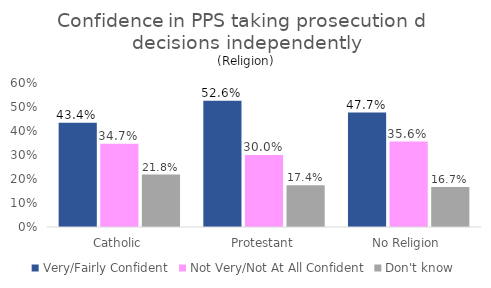
| Category | Very/Fairly Confident | Not Very/Not At All Confident | Don't know |
|---|---|---|---|
| Catholic | 0.434 | 0.347 | 0.218 |
| Protestant | 0.526 | 0.3 | 0.174 |
| No Religion | 0.477 | 0.356 | 0.167 |